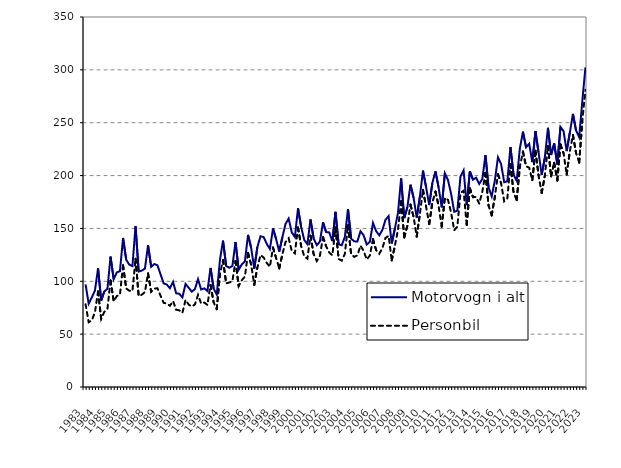
| Category | Motorvogn i alt | Personbil |
|---|---|---|
| 1983.0 | 97 | 78.3 |
| nan | 78.8 | 61.3 |
| nan | 84.8 | 63 |
| nan | 91.2 | 70.8 |
| 1984.0 | 112.2 | 90.4 |
| nan | 81.8 | 64.4 |
| nan | 90.4 | 71.1 |
| nan | 92.9 | 73.9 |
| 1985.0 | 123.4 | 100.8 |
| nan | 102 | 81.1 |
| nan | 108.4 | 86 |
| nan | 109.6 | 87.1 |
| 1986.0 | 141 | 115.2 |
| nan | 120.5 | 93.2 |
| nan | 115.7 | 91.1 |
| nan | 114.4 | 90.8 |
| 1987.0 | 152.2 | 121.3 |
| nan | 109.2 | 86.1 |
| nan | 110.1 | 87.3 |
| nan | 112 | 89.8 |
| 1988.0 | 134.1 | 107.5 |
| nan | 113.7 | 90 |
| nan | 116.3 | 93.1 |
| nan | 115.2 | 93.4 |
| 1989.0 | 106.6 | 86.4 |
| nan | 98 | 79.6 |
| nan | 96.9 | 79 |
| nan | 93.4 | 76.8 |
| 1990.0 | 99.4 | 81.3 |
| nan | 88.6 | 73.1 |
| nan | 88.2 | 72.5 |
| nan | 84.8 | 70.2 |
| 1991.0 | 97.5 | 82.4 |
| nan | 93.9 | 78 |
| nan | 90.2 | 76.1 |
| nan | 92.6 | 78.1 |
| 1992.0 | 102 | 87.1 |
| nan | 92.2 | 78.9 |
| nan | 93.3 | 79.9 |
| nan | 90.8 | 77.6 |
| 1993.0 | 112.6 | 96.5 |
| nan | 93 | 80.1 |
| nan | 87.5 | 73.6 |
| nan | 120.1 | 106.6 |
| 1994.0 | 138.4 | 120 |
| nan | 114.5 | 98.1 |
| nan | 112.8 | 98.8 |
| nan | 114.5 | 100.2 |
| 1995.0 | 137.2 | 119.3 |
| nan | 111 | 95.4 |
| nan | 115.9 | 101 |
| nan | 118.8 | 104.4 |
| 1996.0 | 143.9 | 126.9 |
| nan | 131.6 | 115.7 |
| nan | 112 | 96.7 |
| nan | 132.5 | 113.1 |
| 1997.0 | 142.6 | 124.8 |
| nan | 141.8 | 122.5 |
| nan | 135.4 | 117.3 |
| nan | 130.6 | 113.7 |
| 1998.0 | 150 | 131.9 |
| nan | 139.8 | 122 |
| nan | 128.1 | 112.1 |
| nan | 141.8 | 125.6 |
| 1999.0 | 154.2 | 137.1 |
| nan | 159.3 | 140.7 |
| nan | 146.3 | 128.7 |
| nan | 141.9 | 126.4 |
| 2000.0 | 169.1 | 150.9 |
| nan | 151.5 | 133.4 |
| nan | 139 | 123.5 |
| nan | 135.1 | 121.4 |
| 2001.0 | 158.5 | 143.1 |
| nan | 140.46 | 125.7 |
| nan | 134.24 | 119.2 |
| nan | 137.495 | 124.072 |
| 2002.0 | 155.814 | 141.724 |
| nan | 146.543 | 133.19 |
| nan | 146.231 | 127.141 |
| nan | 137.967 | 124.641 |
| 2003.0 | 165.679 | 150.811 |
| nan | 135.021 | 121.101 |
| nan | 134.111 | 119.491 |
| nan | 142.013 | 125.959 |
| 2004.0 | 168.309 | 153.043 |
| nan | 140.267 | 125.568 |
| nan | 137.77 | 123.121 |
| nan | 137.685 | 124.506 |
| 2005.0 | 147.311 | 133.756 |
| nan | 143.517 | 128.79 |
| nan | 134.783 | 120.571 |
| nan | 137.37 | 124.382 |
| 2006.0 | 155.213 | 139.728 |
| nan | 147.444 | 129.572 |
| nan | 143.451 | 126.006 |
| nan | 148.561 | 131.195 |
| 2007.0 | 158.1 | 141.084 |
| nan | 161.613 | 142.897 |
| nan | 135.821 | 119.753 |
| nan | 149.791 | 133.498 |
| 2008.0 | 164.642 | 148.614 |
| nan | 197.287 | 175.714 |
| nan | 159.718 | 141.407 |
| nan | 170.057 | 152.54 |
| 2009.0 | 191.38 | 172.559 |
| nan | 178.906 | 160.765 |
| nan | 160.234 | 142.312 |
| nan | 179.857 | 163.532 |
| 2010.0 | 204.636 | 186.507 |
| nan | 188.957 | 170.463 |
| nan | 172.077 | 154.156 |
| nan | 192.961 | 174.399 |
| 2011.0 | 204.005 | 184.86 |
| nan | 188.741 | 171.333 |
| nan | 169.934 | 151.694 |
| nan | 202.176 | 178.919 |
| 2012.0 | 195.829 | 177.072 |
| nan | 182.751 | 165.128 |
| nan | 165.73 | 148.242 |
| nan | 166.805 | 151.728 |
| 2013.0 | 199.181 | 183.653 |
| nan | 205.015 | 185.634 |
| nan | 172.044 | 153.21 |
| nan | 204.1 | 188.079 |
| 2014.0 | 196.177 | 179.552 |
| nan | 197.965 | 179.767 |
| nan | 192.105 | 173.474 |
| nan | 196.809 | 184.739 |
| 2015.0 | 219.419 | 202.592 |
| nan | 188.696 | 171.451 |
| nan | 180.388 | 162.297 |
| nan | 195.23 | 179.891 |
| 2016.0 | 217.298 | 201.197 |
| nan | 210.949 | 192.893 |
| nan | 193.648 | 175.642 |
| nan | 194.663 | 178.455 |
| 2017.0 | 227.029 | 210.738 |
| nan | 200.767 | 183.708 |
| nan | 195.059 | 176.766 |
| nan | 225.423 | 208.218 |
| 2018.0 | 241.528 | 222.678 |
| nan | 226.771 | 208.839 |
| nan | 230.044 | 207.395 |
| nan | 212.667 | 195.666 |
| 2019.0 | 242.056 | 223.584 |
| nan | 221.711 | 199.972 |
| nan | 200.668 | 183.518 |
| nan | 216.92 | 199.72 |
| 2020.0 | 245.163 | 227.947 |
| nan | 219.434 | 199.239 |
| nan | 230.409 | 212.039 |
| nan | 210.538 | 195.423 |
| 2021.0 | 246.037 | 229.482 |
| nan | 241.941 | 221.096 |
| nan | 223.162 | 200.95 |
| nan | 240.674 | 222.834 |
| 2022.0 | 258.319 | 238.379 |
| nan | 242.592 | 221.267 |
| nan | 236.373 | 212.275 |
| nan | 270.368 | 251.769 |
| 2023.0 | 302.388 | 281.084 |